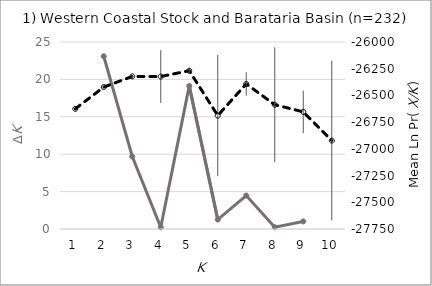
| Category | Evanno's ΔK |
|---|---|
| 0 | 0 |
| 1 | 23.096 |
| 2 | 9.691 |
| 3 | 0.225 |
| 4 | 19.133 |
| 5 | 1.263 |
| 6 | 4.473 |
| 7 | 0.238 |
| 8 | 1.013 |
| 9 | 0 |